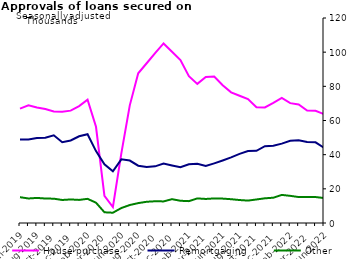
| Category | House purchase | Remortgaging | Other |
|---|---|---|---|
| Jun-2019 | 66985 | 48850 | 15104 |
| Jul-2019 | 68891 | 48867 | 14353 |
| Aug-2019 | 67557 | 49818 | 14681 |
| Sep-2019 | 66694 | 49918 | 14334 |
| Oct-2019 | 65323 | 51311 | 14237 |
| Nov-2019 | 65167 | 47288 | 13475 |
| Dec-2019 | 65766 | 48323 | 13790 |
| Jan-2020 | 68443 | 50751 | 13514 |
| Feb-2020 | 72171 | 51936 | 14148 |
| Mar-2020 | 56317 | 42100 | 11890 |
| Apr-2020 | 15835 | 34396 | 6277 |
| May-2020 | 9290 | 30293 | 6013 |
| Jun-2020 | 40740 | 37285 | 8760 |
| Jul-2020 | 68871 | 36549 | 10528 |
| Aug-2020 | 87668 | 33552 | 11643 |
| Sep-2020 | 93513 | 32717 | 12427 |
| Oct-2020 | 99436 | 33167 | 12725 |
| Nov-2020 | 105095 | 34867 | 12639 |
| Dec-2020 | 100247 | 33702 | 13945 |
| Jan-2021 | 95326 | 32605 | 13014 |
| Feb-2021 | 85967 | 34335 | 12792 |
| Mar-2021 | 81442 | 34663 | 14391 |
| Apr-2021 | 85497 | 33325 | 14078 |
| May-2021 | 85775 | 34929 | 14379 |
| Jun-2021 | 80635 | 36620 | 14276 |
| Jul-2021 | 76478 | 38408 | 13929 |
| Aug-2021 | 74492 | 40448 | 13441 |
| Sep-2021 | 72574 | 42099 | 13120 |
| Oct-2021 | 67807 | 42280 | 13775 |
| Nov-2021 | 67679 | 44976 | 14453 |
| Dec-2021 | 70306 | 45251 | 14799 |
| Jan-2022 | 73220 | 46461 | 16448 |
| Feb-2022 | 70148 | 48112 | 15900 |
| Mar-2022 | 69416 | 48370 | 15190 |
| Apr-2022 | 65884 | 47447 | 15270 |
| May-2022 | 65681 | 47244 | 15188 |
| Jun-2022 | 63726 | 44049 | 14627 |